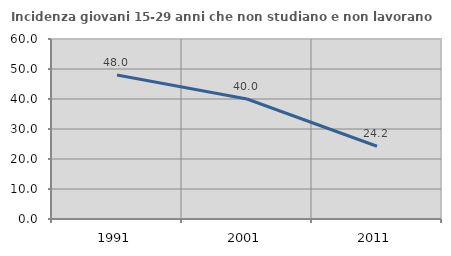
| Category | Incidenza giovani 15-29 anni che non studiano e non lavorano  |
|---|---|
| 1991.0 | 48.025 |
| 2001.0 | 40 |
| 2011.0 | 24.242 |